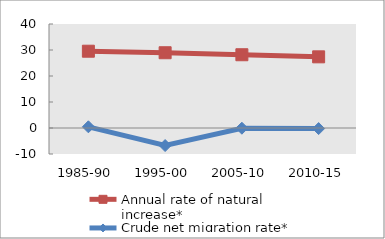
| Category | Annual rate of natural increase* | Crude net migration rate* |
|---|---|---|
| 1985-90 | 29.536 | 0.46 |
| 1995-00 | 28.946 | -6.749 |
| 2005-10 | 28.179 | -0.083 |
| 2010-15 | 27.369 | -0.225 |